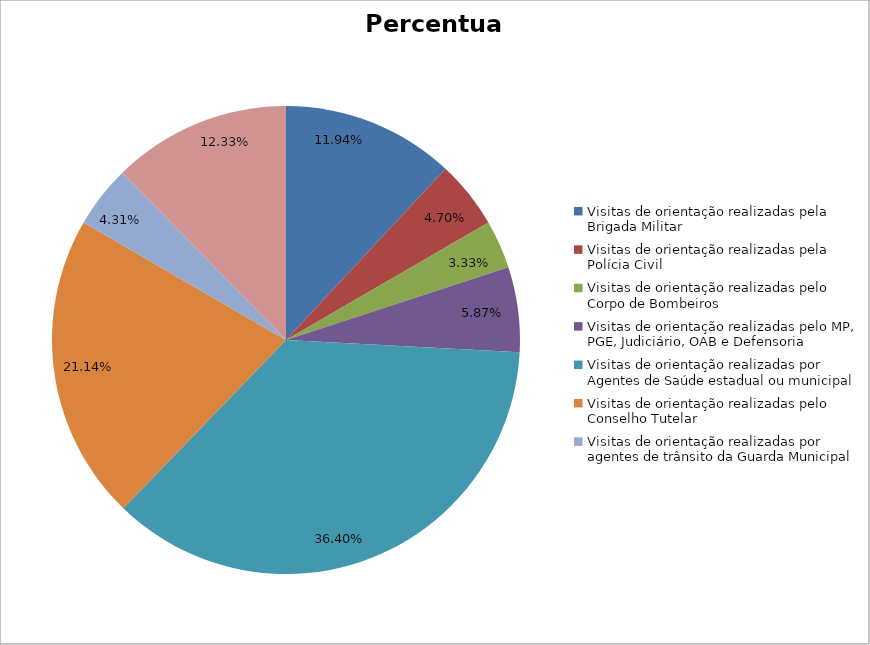
| Category | Percentual |
|---|---|
| Visitas de orientação realizadas pela Brigada Militar | 0.119 |
| Visitas de orientação realizadas pela Polícia Civil | 0.047 |
| Visitas de orientação realizadas pelo Corpo de Bombeiros | 0.033 |
| Visitas de orientação realizadas pelo MP, PGE, Judiciário, OAB e Defensoria | 0.059 |
| Visitas de orientação realizadas por Agentes de Saúde estadual ou municipal | 0.364 |
| Visitas de orientação realizadas pelo Conselho Tutelar | 0.211 |
| Visitas de orientação realizadas por agentes de trânsito da Guarda Municipal | 0.043 |
| Visitas de orientação realizadas por ONGs, entidades privadas, CRAS e CREAS | 0.123 |